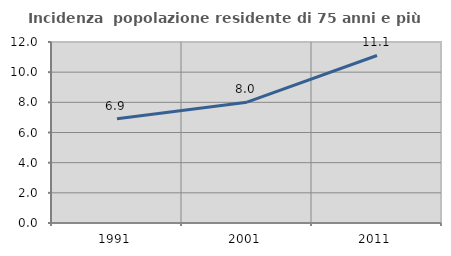
| Category | Incidenza  popolazione residente di 75 anni e più |
|---|---|
| 1991.0 | 6.912 |
| 2001.0 | 8.01 |
| 2011.0 | 11.107 |